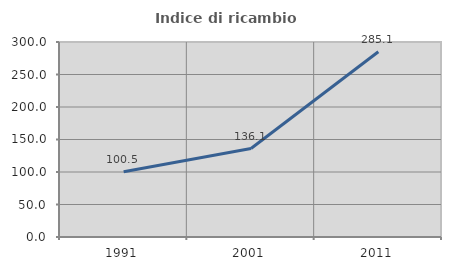
| Category | Indice di ricambio occupazionale  |
|---|---|
| 1991.0 | 100.476 |
| 2001.0 | 136.058 |
| 2011.0 | 285.075 |